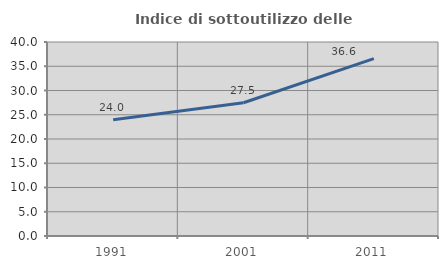
| Category | Indice di sottoutilizzo delle abitazioni  |
|---|---|
| 1991.0 | 23.96 |
| 2001.0 | 27.468 |
| 2011.0 | 36.579 |